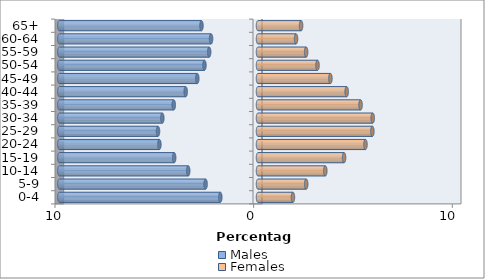
| Category | Males | Females |
|---|---|---|
| 0-4 | -1.897 | 1.758 |
| 5-9 | -2.638 | 2.425 |
| 10-14 | -3.513 | 3.387 |
| 15-19 | -4.22 | 4.333 |
| 20-24 | -4.963 | 5.41 |
| 25-29 | -5.034 | 5.757 |
| 30-34 | -4.816 | 5.774 |
| 35-39 | -4.241 | 5.163 |
| 40-44 | -3.639 | 4.464 |
| 45-49 | -3.057 | 3.645 |
| 50-54 | -2.696 | 2.996 |
| 55-59 | -2.458 | 2.423 |
| 60-64 | -2.362 | 1.915 |
| 65+ | -2.846 | 2.17 |